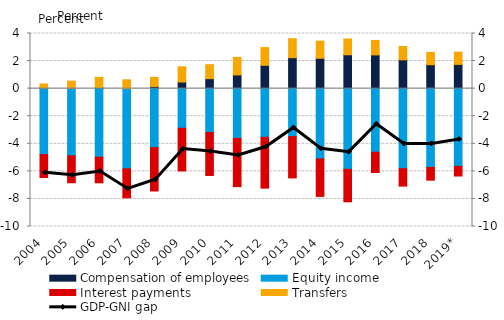
| Category | Compensation of employees | Equity income | Interest payments | Transfers |
|---|---|---|---|---|
| 2004 | 0.05 | -4.781 | -1.665 | 0.291 |
| 2005 | 0.026 | -4.876 | -1.95 | 0.52 |
| 2006 | 0.074 | -4.974 | -1.855 | 0.743 |
| 2007 | 0.004 | -5.816 | -2.103 | 0.638 |
| 2008 | 0.158 | -4.278 | -3.144 | 0.657 |
| 2009 | 0.48 | -2.874 | -3.096 | 1.104 |
| 2010 | 0.725 | -3.179 | -3.12 | 1.012 |
| 2011 | 0.998 | -3.607 | -3.501 | 1.269 |
| 2012 | 1.693 | -3.53 | -3.684 | 1.286 |
| 2013 | 2.245 | -3.481 | -2.994 | 1.377 |
| 2014 | 2.202 | -5.098 | -2.716 | 1.245 |
| 2015 | 2.458 | -5.851 | -2.356 | 1.142 |
| 2016 | 2.449 | -4.612 | -1.472 | 1.049 |
| 2017 | 2.089 | -5.808 | -1.262 | 0.967 |
| 2018 | 1.736 | -5.715 | -0.924 | 0.895 |
| 2019* | 1.759 | -5.64 | -0.698 | 0.887 |